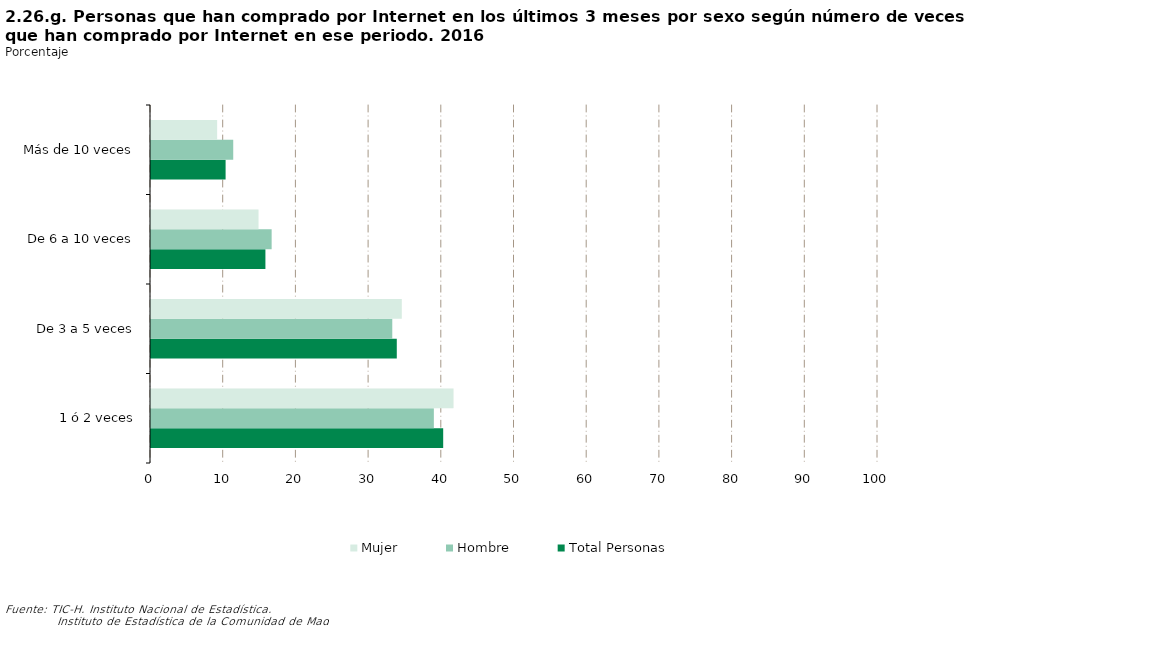
| Category | Total Personas | Hombre | Mujer |
|---|---|---|---|
| 1 ó 2 veces | 40.192 | 38.907 | 41.615 |
| De 3 a 5 veces | 33.808 | 33.187 | 34.495 |
| De 6 a 10 veces | 15.738 | 16.595 | 14.79 |
| Más de 10 veces | 10.261 | 11.311 | 9.1 |